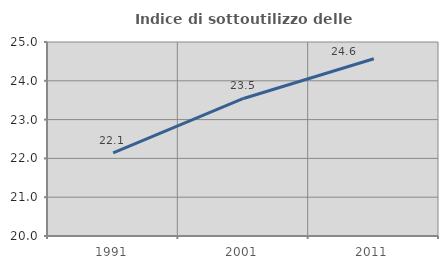
| Category | Indice di sottoutilizzo delle abitazioni  |
|---|---|
| 1991.0 | 22.143 |
| 2001.0 | 23.544 |
| 2011.0 | 24.568 |